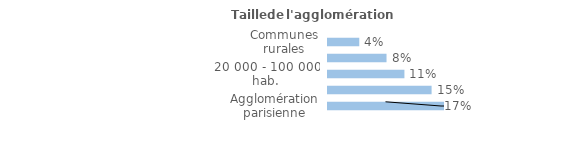
| Category | Series 0 |
|---|---|
| Communes rurales | 0.045 |
| moins de 20 000 hab. | 0.084 |
| 20 000 - 100 000 hab. | 0.11 |
| 100 000 hab. ou plus | 0.149 |
| Agglomération parisienne | 0.166 |